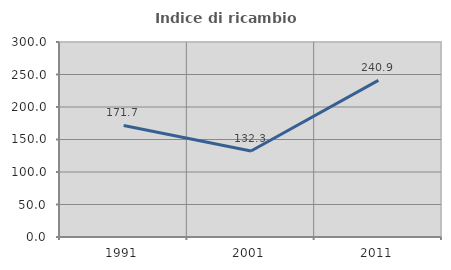
| Category | Indice di ricambio occupazionale  |
|---|---|
| 1991.0 | 171.66 |
| 2001.0 | 132.337 |
| 2011.0 | 240.925 |